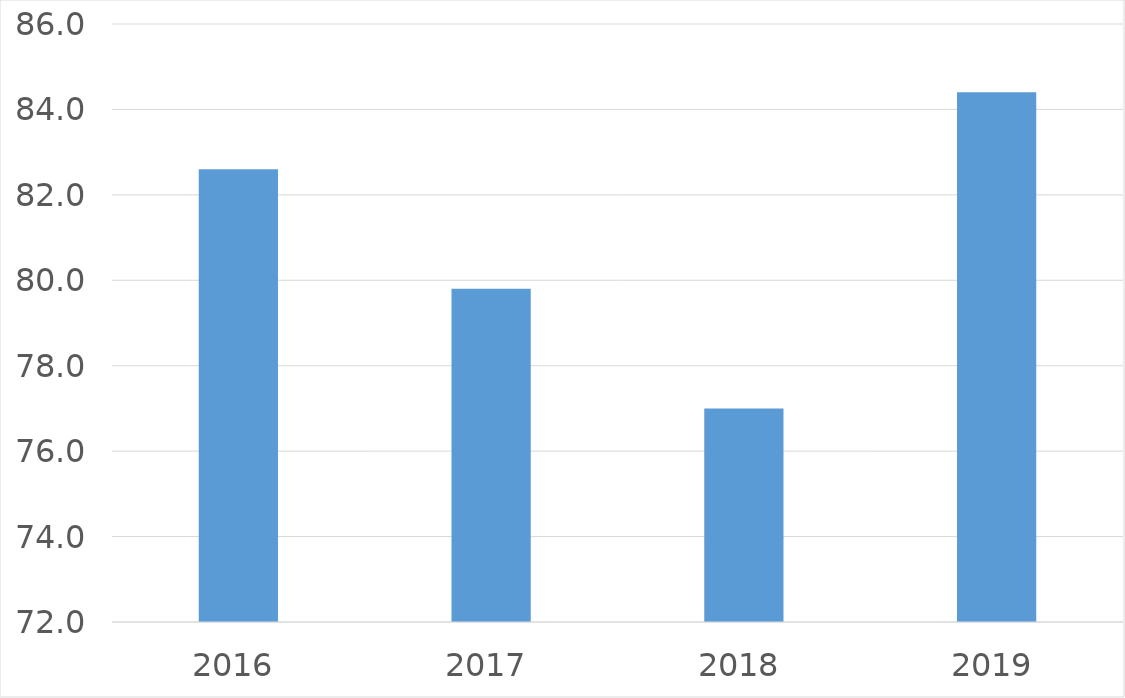
| Category | Series 0 |
|---|---|
| 2016 | 82.6 |
| 2017 | 79.8 |
| 2018 | 77 |
| 2019 | 84.4 |